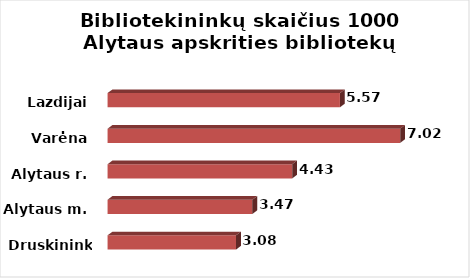
| Category | Series 0 |
|---|---|
| Druskininkai | 3.08 |
| Alytaus m. | 3.47 |
| Alytaus r. | 4.426 |
| Varėna | 7.015 |
| Lazdijai | 5.57 |